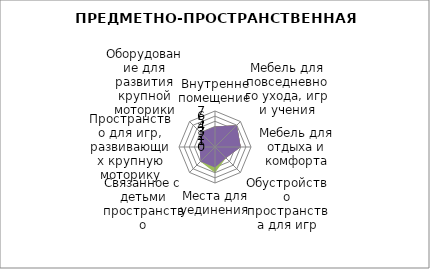
| Category | Series 0 | Series 1 | Series 2 | Series 3 |
|---|---|---|---|---|
| Внутренне помещение | 4 | 4 | 4 | 4 |
| Мебель для повседневного ухода, игр и учения | 6 | 6 | 6 | 6 |
| Мебель для отдыха и комфорта | 5 | 5 | 5 | 5 |
| Обустройство пространства для игр | 3 | 3 | 3 | 3 |
| Места для уединения | 4 | 4 | 5 | 4 |
| Связанное с детьми пространство | 3 | 3 | 4 | 4 |
| Пространство для игр, развивающих крупную моторику | 3 | 3 | 3 | 3 |
| Оборудование для развития крупной моторики | 3 | 3 | 4 | 4 |